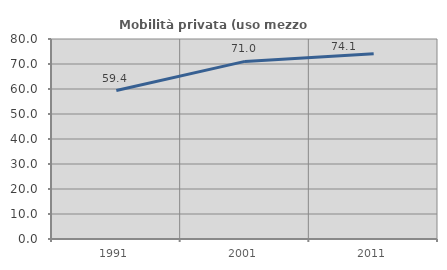
| Category | Mobilità privata (uso mezzo privato) |
|---|---|
| 1991.0 | 59.383 |
| 2001.0 | 71.049 |
| 2011.0 | 74.124 |